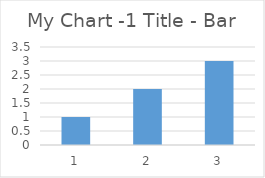
| Category | Series 0 |
|---|---|
| 0 | 1 |
| 1 | 2 |
| 2 | 3 |